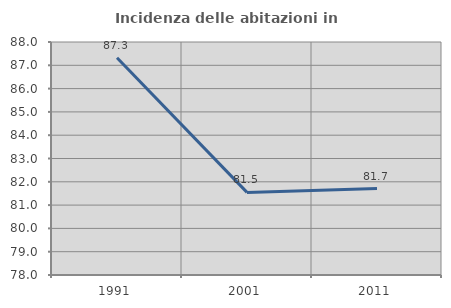
| Category | Incidenza delle abitazioni in proprietà  |
|---|---|
| 1991.0 | 87.324 |
| 2001.0 | 81.545 |
| 2011.0 | 81.707 |